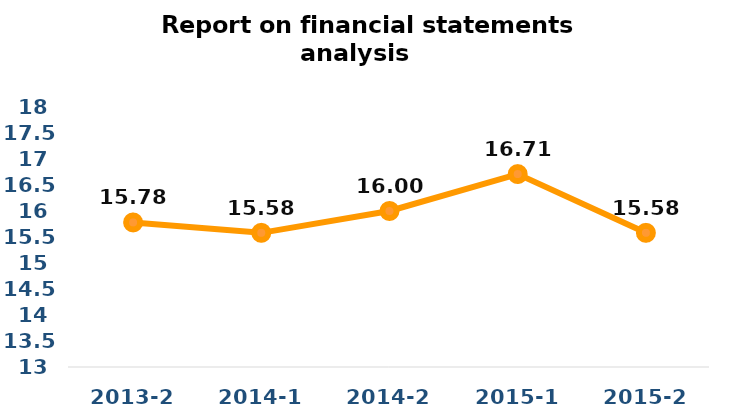
| Category | Series 0 |
|---|---|
| 2013-2 | 15.78 |
| 2014-1 | 15.58 |
| 2014-2 | 16 |
| 2015-1 | 16.71 |
| 2015-2 | 15.58 |